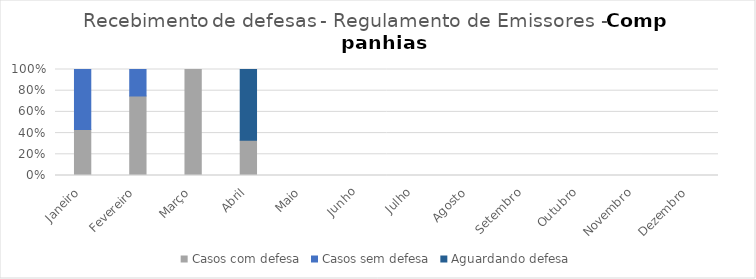
| Category | Casos com defesa | Casos sem defesa | Aguardando defesa |
|---|---|---|---|
| Janeiro | 13 | 17 | 0 |
| Fevereiro | 3 | 1 | 0 |
| Março | 1 | 0 | 0 |
| Abril | 2 | 0 | 4 |
| Maio | 0 | 0 | 0 |
| Junho | 0 | 0 | 0 |
| Julho | 0 | 0 | 0 |
| Agosto | 0 | 0 | 0 |
| Setembro | 0 | 0 | 0 |
| Outubro | 0 | 0 | 0 |
| Novembro | 0 | 0 | 0 |
| Dezembro | 0 | 0 | 0 |